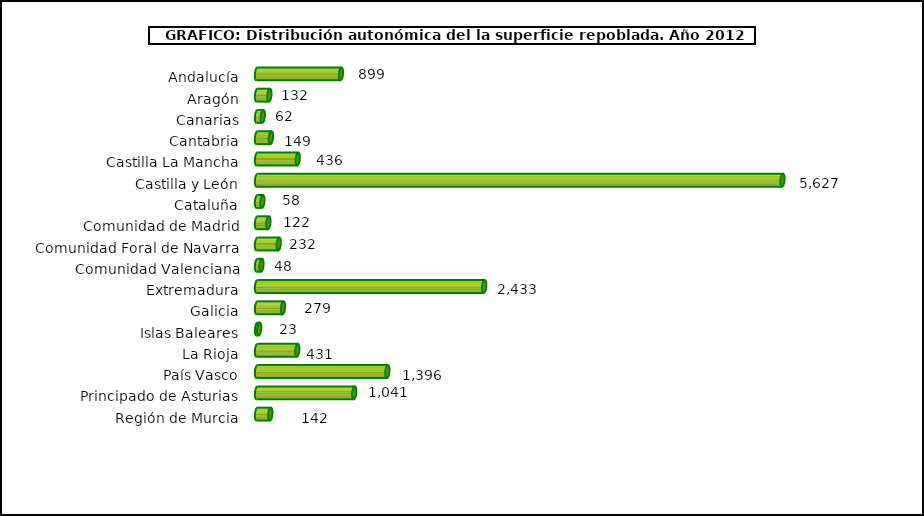
| Category | repoblacion |
|---|---|
| Andalucía | 898.74 |
| Aragón | 132.45 |
| Canarias | 61.57 |
| Cantabria | 148.9 |
| Castilla La Mancha | 436.1 |
| Castilla y León | 5627.05 |
| Cataluña | 57.61 |
| Comunidad de Madrid | 121.673 |
| Comunidad Foral de Navarra | 232.25 |
| Comunidad Valenciana | 47.73 |
| Extremadura | 2432.85 |
| Galicia | 278.54 |
| Islas Baleares | 22.81 |
| La Rioja | 431.286 |
| País Vasco | 1395.67 |
| Principado de Asturias | 1041.21 |
| Región de Murcia | 142.36 |